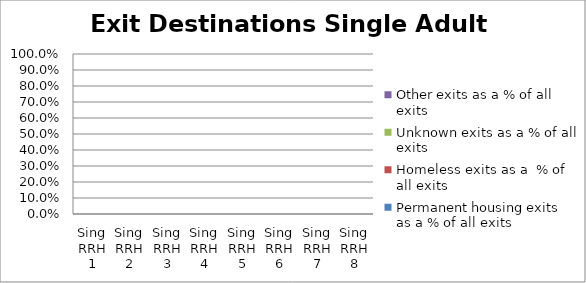
| Category | Permanent housing exits as a % of all exits | Homeless exits as a  % of all exits | Unknown exits as a % of all exits | Other exits as a % of all exits |
|---|---|---|---|---|
| Sing RRH 1 | 0 | 0 | 0 | 0 |
| Sing RRH 2 | 0 | 0 | 0 | 0 |
| Sing RRH 3 | 0 | 0 | 0 | 0 |
| Sing RRH 4 | 0 | 0 | 0 | 0 |
| Sing RRH 5 | 0 | 0 | 0 | 0 |
| Sing RRH 6 | 0 | 0 | 0 | 0 |
| Sing RRH 7 | 0 | 0 | 0 | 0 |
| Sing RRH 8 | 0 | 0 | 0 | 0 |